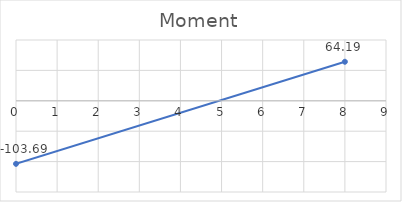
| Category | Series 0 |
|---|---|
| 0.0 | -103.69 |
| 8.0 | 64.191 |